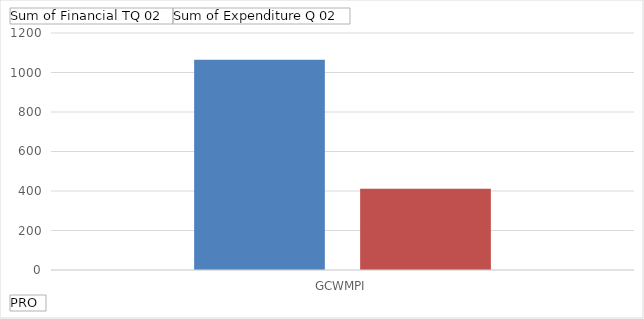
| Category | Sum of Financial TQ 02 | Sum of Expenditure Q 02 |
|---|---|---|
| GCWMPI | 1064.1 | 411.8 |